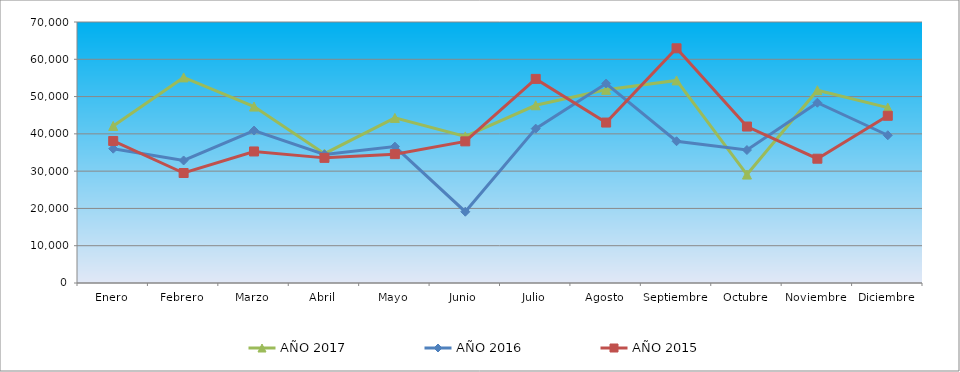
| Category | AÑO 2017 | AÑO 2016 | AÑO 2015 |
|---|---|---|---|
| Enero | 42124.789 | 36022.092 | 38100 |
| Febrero | 55139.023 | 32859.508 | 29500 |
| Marzo | 47316.569 | 40887.368 | 35280 |
| Abril | 34687.555 | 34499.134 | 33559.421 |
| Mayo | 44276.513 | 36574.737 | 34560.264 |
| Junio | 39323.13 | 19117.452 | 37984.269 |
| Julio | 47669.897 | 41399.646 | 54739.426 |
| Agosto | 51813.659 | 53498.69 | 43031.518 |
| Septiembre | 54331.778 | 38023.053 | 62946.525 |
| Octubre | 29082.487 | 35665.08 | 41962.573 |
| Noviembre | 51695.224 | 48347.364 | 33334.032 |
| Diciembre | 47024.515 | 39624.517 | 44848.687 |